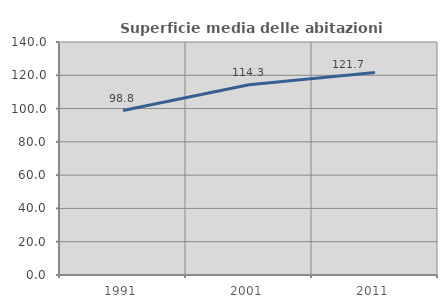
| Category | Superficie media delle abitazioni occupate |
|---|---|
| 1991.0 | 98.817 |
| 2001.0 | 114.264 |
| 2011.0 | 121.68 |